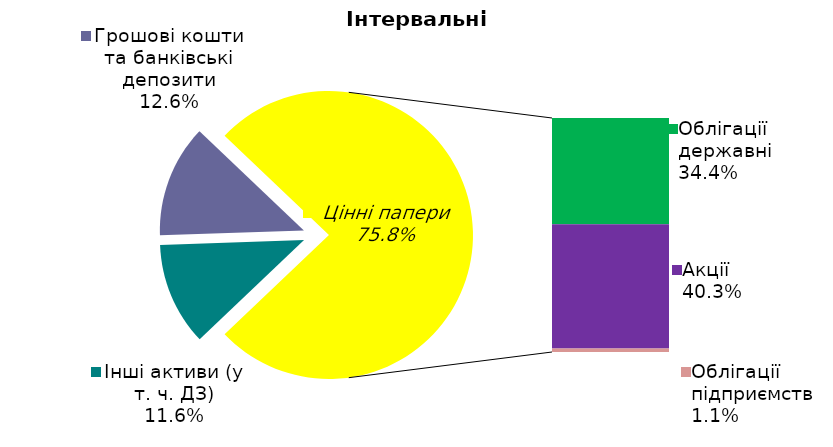
| Category | Series 0 |
|---|---|
| Інші активи (у т. ч. ДЗ) | 0.116 |
| Грошові кошти та банківські депозити | 0.126 |
| Облігації державні  | 0.344 |
| Акції | 0.403 |
| Облігації підприємств | 0.011 |